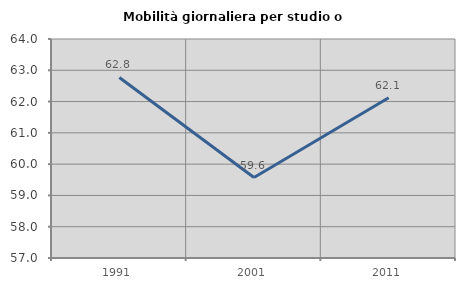
| Category | Mobilità giornaliera per studio o lavoro |
|---|---|
| 1991.0 | 62.77 |
| 2001.0 | 59.573 |
| 2011.0 | 62.122 |